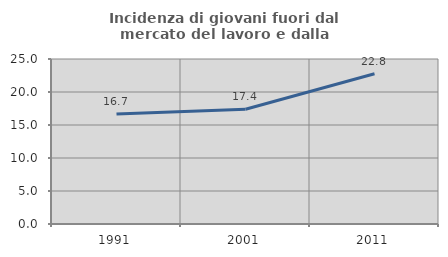
| Category | Incidenza di giovani fuori dal mercato del lavoro e dalla formazione  |
|---|---|
| 1991.0 | 16.667 |
| 2001.0 | 17.38 |
| 2011.0 | 22.772 |